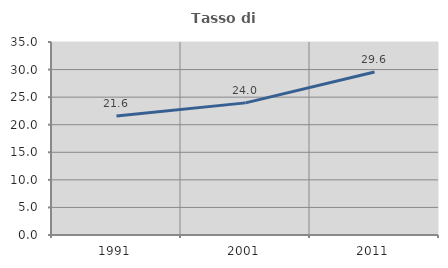
| Category | Tasso di occupazione   |
|---|---|
| 1991.0 | 21.591 |
| 2001.0 | 23.959 |
| 2011.0 | 29.567 |